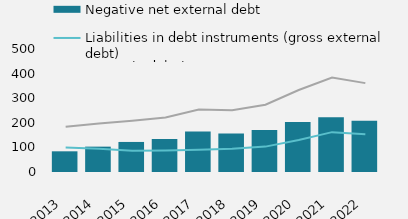
| Category | Negative net external debt |
|---|---|
| 2013 | 84.105 |
| 2014 | 103.091 |
| 2015 | 122.16 |
| 2016 | 134.149 |
| 2017 | 164.164 |
| 2018 | 156.359 |
| 2019 | 170.257 |
| 2020 | 202.924 |
| 2021 | 222.225 |
| 2022 | 208.246 |